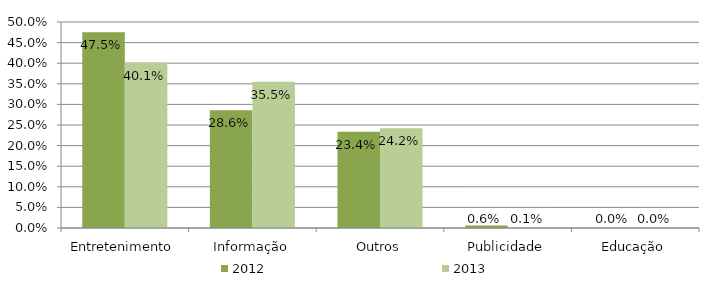
| Category | 2012 | 2013 |
|---|---|---|
| Entretenimento | 0.475 | 0.401 |
| Informação | 0.286 | 0.355 |
| Outros | 0.234 | 0.242 |
| Publicidade | 0.006 | 0.001 |
| Educação | 0 | 0 |